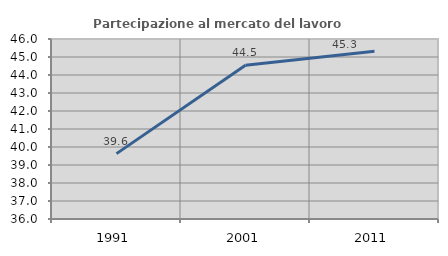
| Category | Partecipazione al mercato del lavoro  femminile |
|---|---|
| 1991.0 | 39.632 |
| 2001.0 | 44.546 |
| 2011.0 | 45.32 |